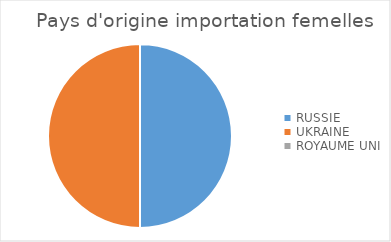
| Category | Series 0 |
|---|---|
| RUSSIE | 1 |
| UKRAINE | 1 |
| ROYAUME UNI | 0 |